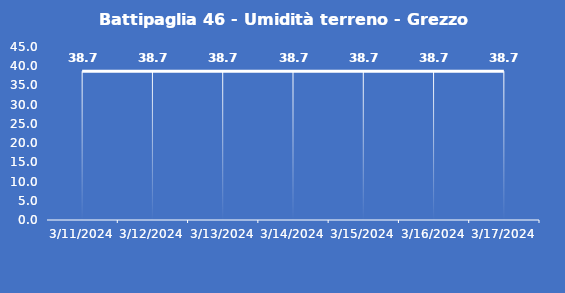
| Category | Battipaglia 46 - Umidità terreno - Grezzo (%VWC) |
|---|---|
| 3/11/24 | 38.7 |
| 3/12/24 | 38.7 |
| 3/13/24 | 38.7 |
| 3/14/24 | 38.7 |
| 3/15/24 | 38.7 |
| 3/16/24 | 38.7 |
| 3/17/24 | 38.7 |